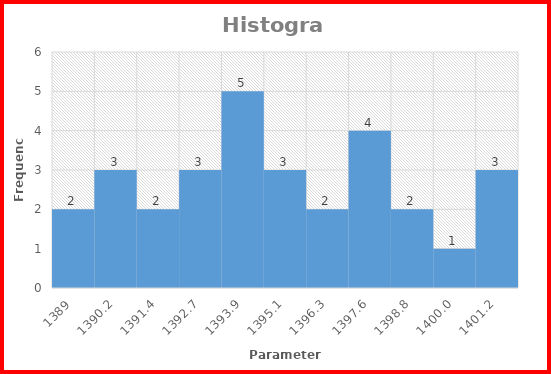
| Category | Series 0 |
|---|---|
| 1389.0 | 2 |
| 1390.2222222222222 | 3 |
| 1391.4444444444443 | 2 |
| 1392.6666666666665 | 3 |
| 1393.8888888888887 | 5 |
| 1395.1111111111109 | 3 |
| 1396.333333333333 | 2 |
| 1397.5555555555552 | 4 |
| 1398.7777777777774 | 2 |
| 1399.9999999999995 | 1 |
| 1401.2222222222217 | 3 |